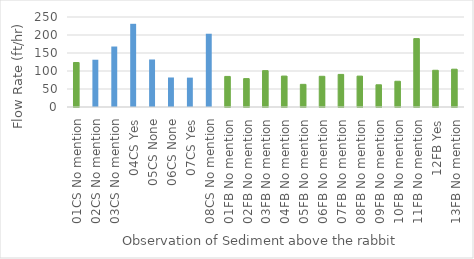
| Category | Weatherford Average Flow Rate during coring (gpm) |
|---|---|
| 01CS No mention | 123.6 |
| 02CS No mention | 131.3 |
| 03CS No mention | 168 |
| 04CS Yes | 231.1 |
| 05CS None | 132 |
| 06CS None | 82 |
| 07CS Yes | 81.6 |
| 08CS No mention | 203.5 |
| 01FB No mention | 84.9 |
| 02FB No mention | 78.9 |
| 03FB No mention | 101 |
| 04FB No mention | 85.9 |
| 05FB No mention | 62.9 |
| 06FB No mention | 85.3 |
| 07FB No mention | 90.5 |
| 08FB No mention | 85.8 |
| 09FB No mention | 61.7 |
| 10FB No mention | 71.5 |
| 11FB No mention | 190 |
| 12FB Yes | 102 |
| 13FB No mention | 105 |